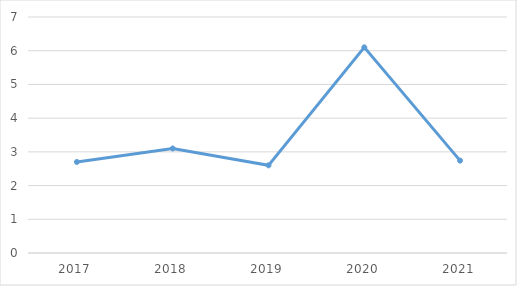
| Category | Series 0 |
|---|---|
| 2017.0 | 2.7 |
| 2018.0 | 3.1 |
| 2019.0 | 2.6 |
| 2020.0 | 6.1 |
| 2021.0 | 2.74 |